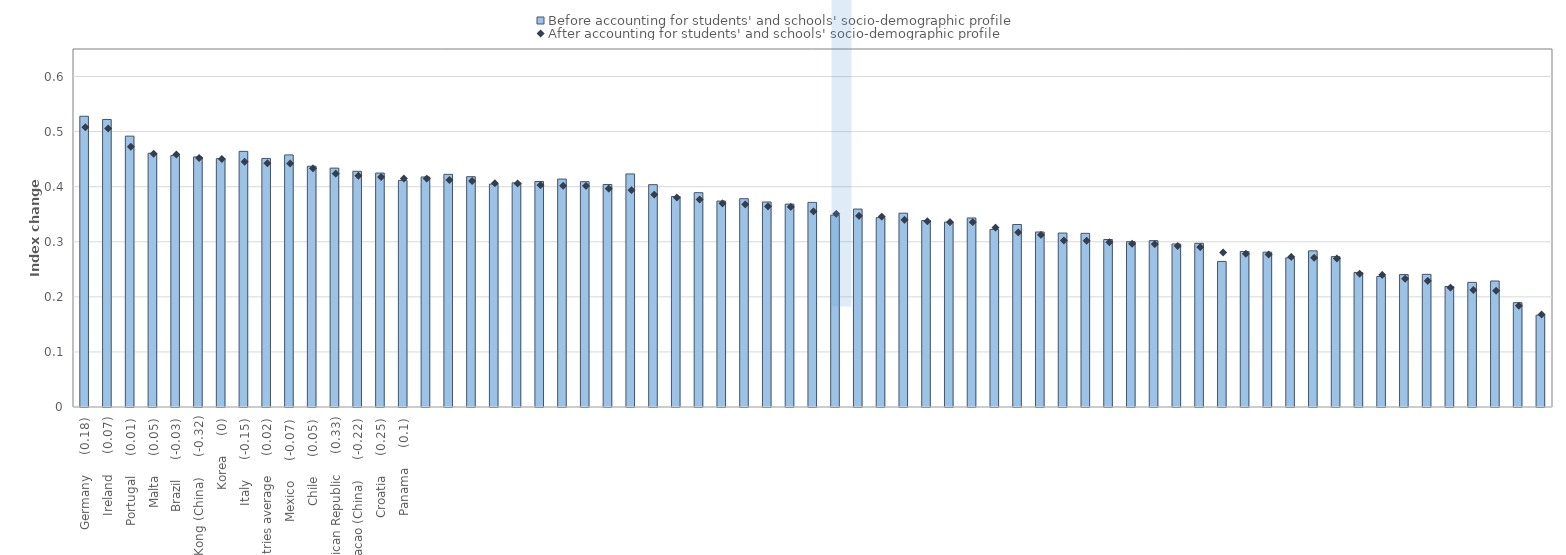
| Category | Before accounting for students' and schools' socio-demographic profile |
|---|---|
| 0 | 0.528 |
| 1 | 0.522 |
| 2 | 0.492 |
| 3 | 0.461 |
| 4 | 0.456 |
| 5 | 0.454 |
| 6 | 0.451 |
| 7 | 0.464 |
| 8 | 0.451 |
| 9 | 0.458 |
| 10 | 0.437 |
| 11 | 0.434 |
| 12 | 0.428 |
| 13 | 0.425 |
| 14 | 0.411 |
| 15 | 0.418 |
| 16 | 0.422 |
| 17 | 0.418 |
| 18 | 0.405 |
| 19 | 0.407 |
| 20 | 0.409 |
| 21 | 0.414 |
| 22 | 0.409 |
| 23 | 0.404 |
| 24 | 0.423 |
| 25 | 0.404 |
| 26 | 0.382 |
| 27 | 0.389 |
| 28 | 0.374 |
| 29 | 0.378 |
| 30 | 0.372 |
| 31 | 0.368 |
| 32 | 0.371 |
| 33 | 0.348 |
| 34 | 0.359 |
| 35 | 0.344 |
| 36 | 0.352 |
| 37 | 0.339 |
| 38 | 0.336 |
| 39 | 0.343 |
| 40 | 0.322 |
| 41 | 0.331 |
| 42 | 0.318 |
| 43 | 0.316 |
| 44 | 0.315 |
| 45 | 0.304 |
| 46 | 0.3 |
| 47 | 0.302 |
| 48 | 0.296 |
| 49 | 0.297 |
| 50 | 0.264 |
| 51 | 0.282 |
| 52 | 0.281 |
| 53 | 0.271 |
| 54 | 0.283 |
| 55 | 0.273 |
| 56 | 0.244 |
| 57 | 0.237 |
| 58 | 0.241 |
| 59 | 0.241 |
| 60 | 0.219 |
| 61 | 0.226 |
| 62 | 0.229 |
| 63 | 0.189 |
| 64 | 0.167 |